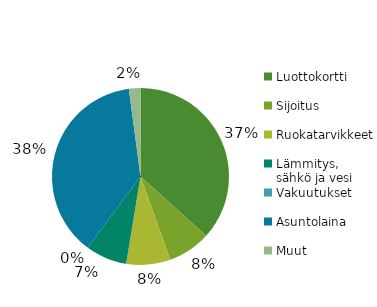
| Category | Yhteensä |
|---|---|
| Luottokortti | 936.48 |
| Sijoitus | 200 |
| Ruokatarvikkeet | 205.61 |
| Lämmitys, sähkö ja vesi | 194.2 |
| Vakuutukset | 0 |
| Asuntolaina | 961.77 |
| Muut | 53.65 |